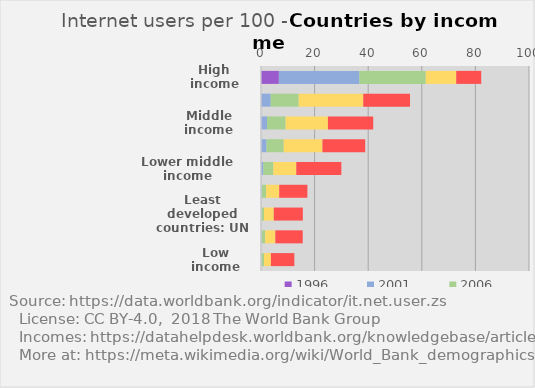
| Category | 1996 | 2001 | 2006 | 2011 | 2016 |
|---|---|---|---|---|---|
| High income | 6.67 | 30.05 | 24.76 | 11.36 | 9.34 |
| Upper middle income | 0.13 | 3.5 | 10.44 | 24.08 | 17.46 |
| Middle income | 0.09 | 2.15 | 6.96 | 15.77 | 16.9 |
| Low & middle income | 0.08 | 1.98 | 6.43 | 14.43 | 15.96 |
| Lower middle income | 0.04 | 0.84 | 3.71 | 8.57 | 16.82 |
| Fragile and conflict affected situations | 0 | 0.26 | 1.63 | 4.91 | 10.51 |
| Least developed countries: UN classification | 0 | 0.15 | 0.97 | 3.65 | 10.84 |
| Heavily indebted poor countries | 0.01 | 0.25 | 1.29 | 3.79 | 10.23 |
| Low income | 0 | 0.17 | 0.96 | 2.57 | 8.74 |